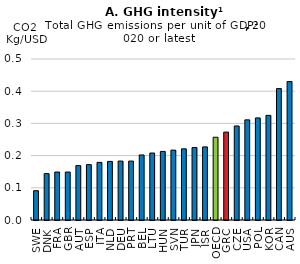
| Category | 2020 or latest |
|---|---|
| SWE | 0.091 |
| DNK | 0.144 |
| FRA | 0.149 |
| GBR | 0.149 |
| AUT | 0.169 |
| ESP | 0.172 |
| ITA | 0.179 |
| NLD | 0.182 |
| DEU | 0.183 |
| PRT | 0.183 |
| BEL | 0.202 |
| LTU | 0.208 |
| HUN | 0.213 |
| SVN | 0.217 |
| TUR | 0.221 |
| JPN | 0.225 |
| ISR | 0.227 |
| OECD | 0.257 |
| GRC | 0.273 |
| CZE | 0.292 |
| USA | 0.311 |
| POL | 0.317 |
| KOR | 0.325 |
| CAN | 0.408 |
| AUS | 0.43 |